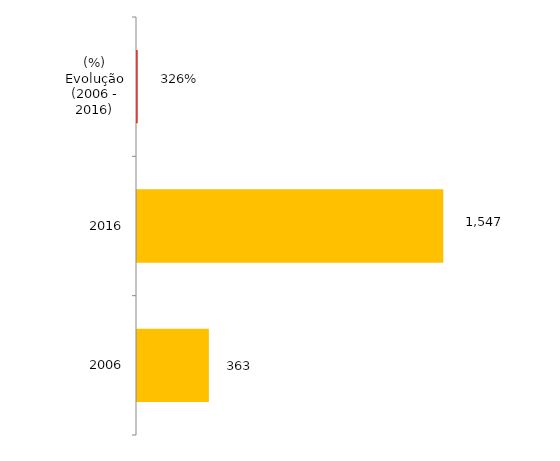
| Category | Total Geral |
|---|---|
| 2006 | 363 |
| 2016 | 1547 |
| (%) Evolução (2006 - 2016) | 3.262 |